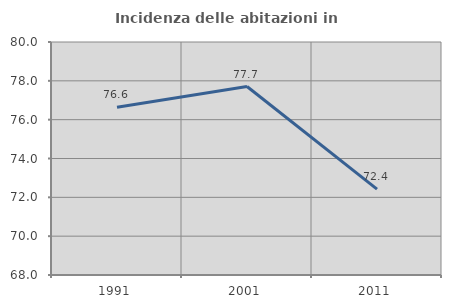
| Category | Incidenza delle abitazioni in proprietà  |
|---|---|
| 1991.0 | 76.645 |
| 2001.0 | 77.708 |
| 2011.0 | 72.426 |